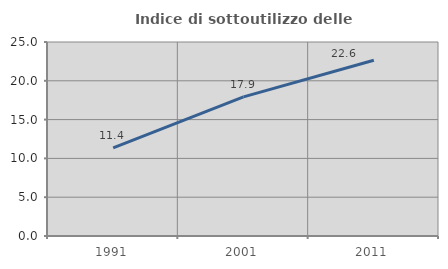
| Category | Indice di sottoutilizzo delle abitazioni  |
|---|---|
| 1991.0 | 11.369 |
| 2001.0 | 17.921 |
| 2011.0 | 22.649 |